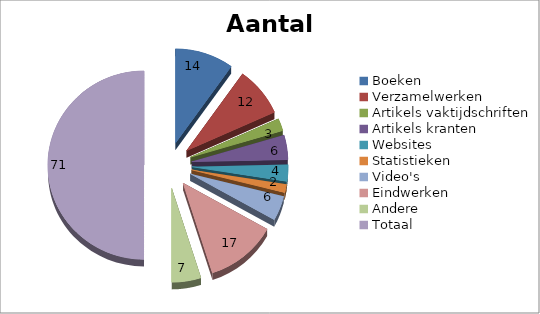
| Category | Aantal | Procent |
|---|---|---|
| Boeken | 14 | 19.718 |
| Verzamelwerken | 12 | 16.901 |
| Artikels vaktijdschriften | 3 | 4.225 |
| Artikels kranten | 6 | 8.451 |
| Websites | 4 | 5.634 |
| Statistieken | 2 | 2.817 |
| Video's | 6 | 8.451 |
| Eindwerken | 17 | 23.944 |
| Andere | 7 | 9.859 |
| Totaal | 71 | 100 |